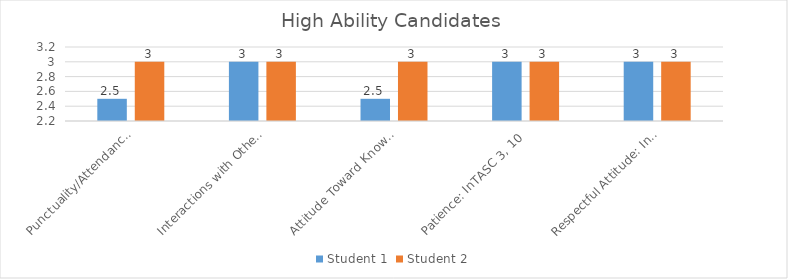
| Category | Student 1 | Student 2 |
|---|---|---|
| Punctuality/Attendance: InTASC 1, 9 | 2.5 | 3 |
| Interactions with Others: InTASC 3, 7, 10 | 3 | 3 |
| Attitude Toward Knowledge and Learning: InTASC 1, 4, 5, 9, 10 | 2.5 | 3 |
| Patience: InTASC 3, 10 | 3 | 3 |
| Respectful Attitude: InTASC 3, 7, 10 | 3 | 3 |